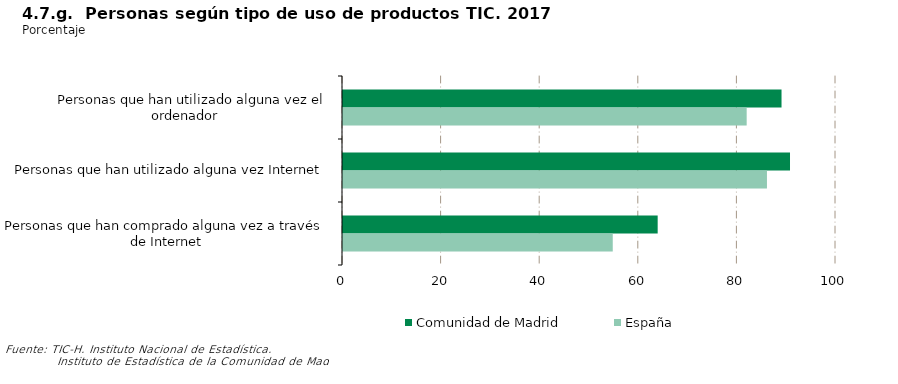
| Category | Comunidad de Madrid | España |
|---|---|---|
|    Personas que han utilizado alguna vez el ordenador  | 88.951 | 81.882 |
| Personas que han utilizado alguna vez Internet | 90.671 | 85.995 |
| Personas que han comprado alguna vez a través de Internet | 63.828 | 54.716 |